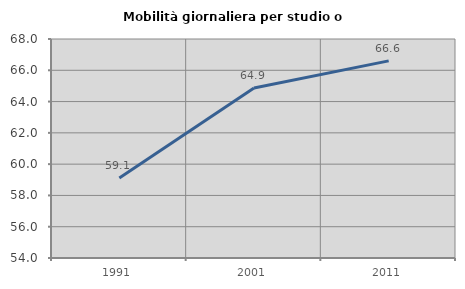
| Category | Mobilità giornaliera per studio o lavoro |
|---|---|
| 1991.0 | 59.12 |
| 2001.0 | 64.872 |
| 2011.0 | 66.603 |